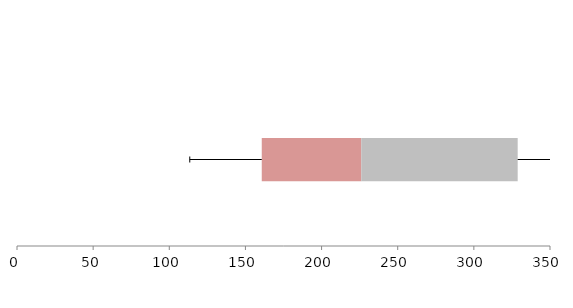
| Category | Series 1 | Series 2 | Series 3 |
|---|---|---|---|
| 0 | 160.724 | 65.343 | 102.717 |